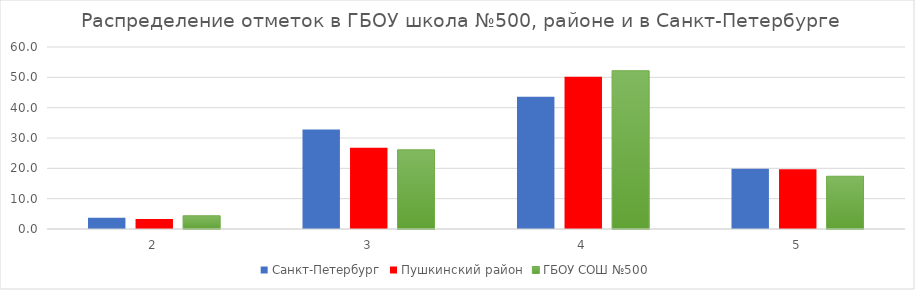
| Category | Санкт-Петербург | Пушкинский район | ГБОУ СОШ №500 |
|---|---|---|---|
| 2.0 | 3.75 | 3.31 | 4.35 |
| 3.0 | 32.79 | 26.76 | 26.09 |
| 4.0 | 43.62 | 50.22 | 52.17 |
| 5.0 | 19.85 | 19.71 | 17.39 |